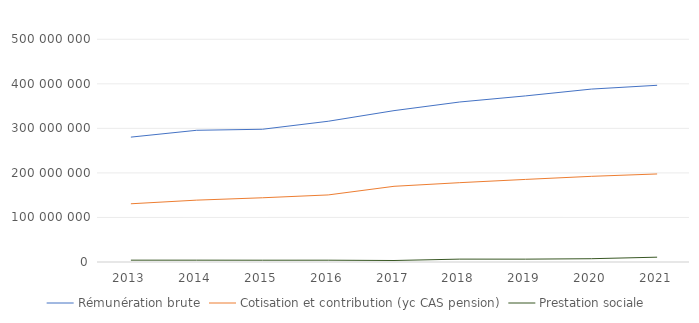
| Category | Rémunération brute | Cotisation et contribution (yc CAS pension) | Prestation sociale |
|---|---|---|---|
| 2013 | 280364341.76 | 130710373.08 | 4133240.8 |
| 2014 | 295662020 | 138902163.19 | 4131043.88 |
| 2015 | 298009220.21 | 144175208.78 | 4027953.17 |
| 2016 | 315947894.66 | 150574977.5 | 4052824.33 |
| 2017 | 339790171.97 | 169939337.75 | 3340071.82 |
| 2018 | 359210250.43 | 178096690.38 | 6465421.03 |
| 2019 | 372895332.42 | 185391177.67 | 6388975.49 |
| 2020 | 388163922 | 192318621.07 | 7375598.7 |
| 2021 | 396681595.31 | 197633122.82 | 10829698.02 |